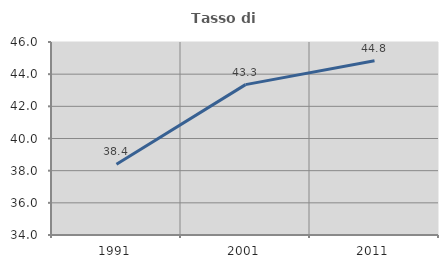
| Category | Tasso di occupazione   |
|---|---|
| 1991.0 | 38.401 |
| 2001.0 | 43.349 |
| 2011.0 | 44.833 |